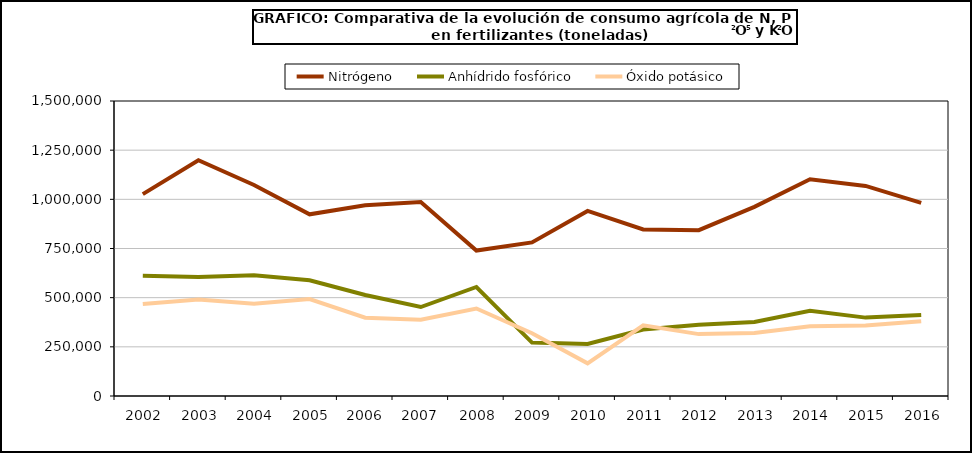
| Category | Nitrógeno | Anhídrido fosfórico | Óxido potásico |
|---|---|---|---|
|   2002 | 1026546 | 610838 | 468360 |
|   2003 | 1198606 | 605224 | 491138 |
|   2004 | 1072949 | 614385 | 468511 |
|   2005 | 923764 | 588820 | 492571 |
|   2006  | 969783 | 513454 | 398230 |
|   2007  | 985857 | 452461 | 388187 |
|   2008 | 739757 | 554382 | 444853 |
|   2009 | 781069 | 271578 | 319194 |
|   2010 | 940984 | 264211 | 166016 |
|   2011 | 846697 | 337812 | 359583 |
|   2012 | 843410 | 362672 | 314642 |
|   2013 | 961507 | 376590 | 320841 |
|   2014 | 1101895 | 432904 | 354738 |
|   2015 | 1068103 | 398580 | 357875 |
|   2016 | 982155 | 411763 | 380303 |